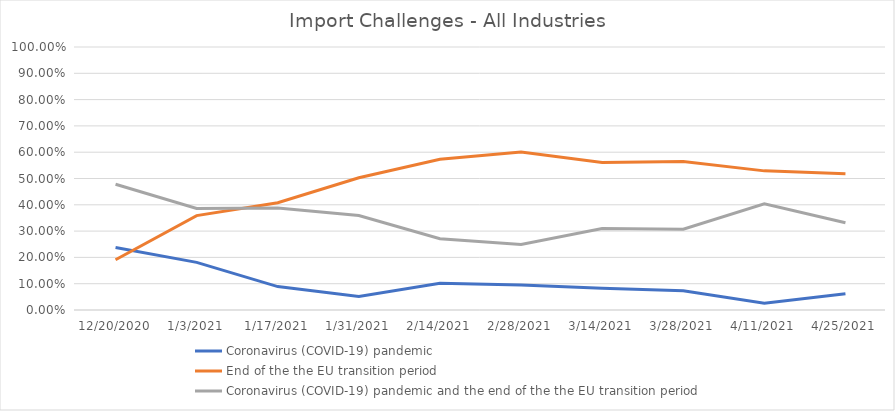
| Category | Coronavirus (COVID-19) pandemic | End of the the EU transition period | Coronavirus (COVID-19) pandemic and the end of the the EU transition period |
|---|---|---|---|
| 12/20/20 | 0.238 | 0.191 | 0.478 |
| 1/3/21 | 0.181 | 0.359 | 0.386 |
| 1/17/21 | 0.089 | 0.408 | 0.388 |
| 1/31/21 | 0.051 | 0.503 | 0.359 |
| 2/14/21 | 0.102 | 0.573 | 0.271 |
| 2/28/21 | 0.095 | 0.601 | 0.249 |
| 3/14/21 | 0.083 | 0.561 | 0.31 |
| 3/28/21 | 0.073 | 0.565 | 0.307 |
| 4/11/21 | 0.026 | 0.529 | 0.404 |
| 4/25/21 | 0.062 | 0.518 | 0.332 |